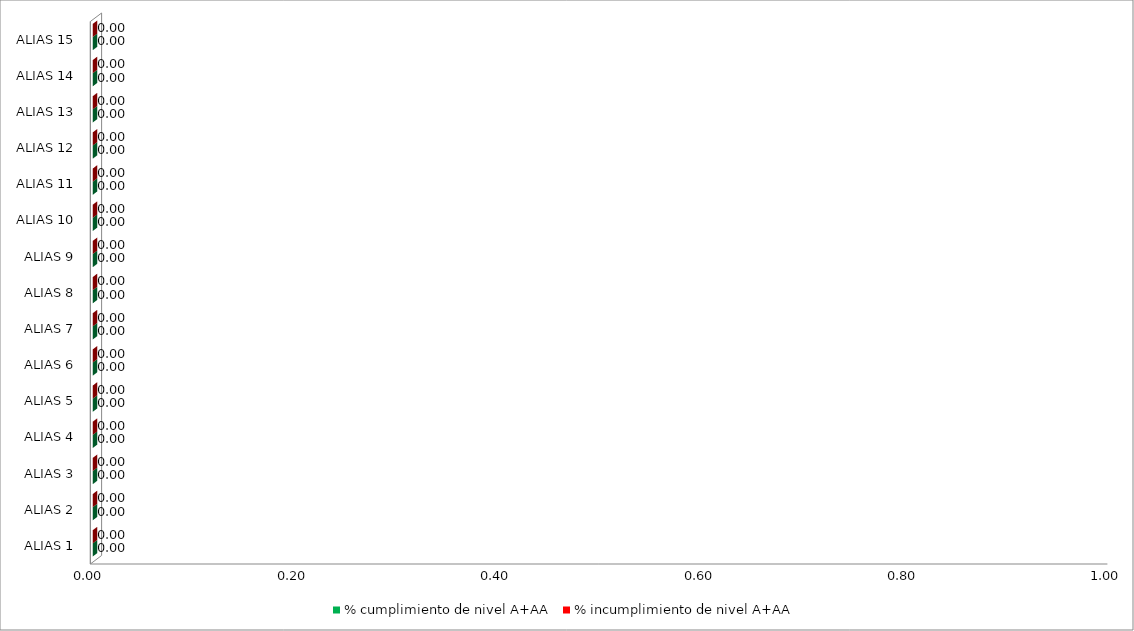
| Category | % cumplimiento de nivel A+AA | % incumplimiento de nivel A+AA |
|---|---|---|
| ALIAS 1 | 0 | 0 |
| ALIAS 2 | 0 | 0 |
| ALIAS 3 | 0 | 0 |
| ALIAS 4 | 0 | 0 |
| ALIAS 5 | 0 | 0 |
| ALIAS 6 | 0 | 0 |
| ALIAS 7 | 0 | 0 |
| ALIAS 8 | 0 | 0 |
| ALIAS 9 | 0 | 0 |
| ALIAS 10 | 0 | 0 |
| ALIAS 11 | 0 | 0 |
| ALIAS 12 | 0 | 0 |
| ALIAS 13 | 0 | 0 |
| ALIAS 14 | 0 | 0 |
| ALIAS 15 | 0 | 0 |